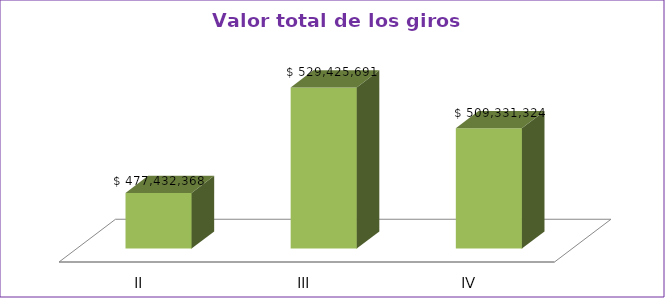
| Category | Series 0 |
|---|---|
| II | 477432368 |
| III | 529425691 |
| IV | 509331324 |